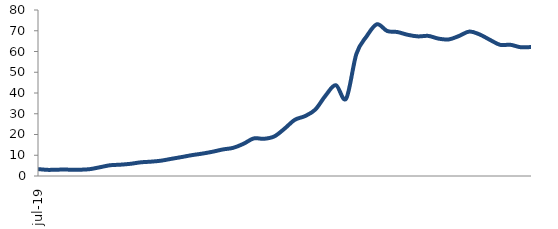
| Category | Series 0 |
|---|---|
| 2019-07-01 | 3.329 |
| 2019-08-01 | 2.95 |
| 2019-09-01 | 3.068 |
| 2019-10-01 | 3.068 |
| 2019-11-01 | 3.019 |
| 2019-12-01 | 3.273 |
| 2020-01-01 | 4.186 |
| 2020-02-01 | 5.17 |
| 2020-03-01 | 5.444 |
| 2020-04-01 | 5.874 |
| 2020-05-01 | 6.591 |
| 2020-06-01 | 6.913 |
| 2020-07-01 | 7.395 |
| 2020-08-01 | 8.292 |
| 2020-09-01 | 9.145 |
| 2020-10-01 | 10.067 |
| 2020-11-01 | 10.794 |
| 2020-12-01 | 11.695 |
| 2021-01-01 | 12.796 |
| 2021-02-01 | 13.569 |
| 2021-03-01 | 15.494 |
| 2021-04-01 | 18.102 |
| 2021-05-01 | 17.933 |
| 2021-06-01 | 19.058 |
| 2021-07-01 | 22.799 |
| 2021-08-01 | 27.071 |
| 2021-09-01 | 28.872 |
| 2021-10-01 | 32.01 |
| 2021-11-01 | 38.771 |
| 2021-12-01 | 43.773 |
| 2022-01-01 | 37.28 |
| 2022-02-01 | 58.857 |
| 2022-03-01 | 67.349 |
| 2022-04-01 | 73.13 |
| 2022-05-01 | 69.874 |
| 2022-06-01 | 69.376 |
| 2022-07-01 | 68.04 |
| 2022-08-01 | 67.278 |
| 2022-09-01 | 67.518 |
| 2022-10-01 | 66.201 |
| 2022-11-01 | 65.824 |
| 2022-12-01 | 67.5 |
| 2023-01-01 | 69.621 |
| 2023-02-01 | 68.213 |
| 2023-03-01 | 65.618 |
| 2023-04-01 | 63.206 |
| 2023-05-01 | 63.235 |
| 2023-06-01 | 62.047 |
| 2023-07-01 | 62.154 |